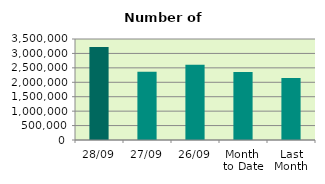
| Category | Series 0 |
|---|---|
| 28/09 | 3222836 |
| 27/09 | 2361406 |
| 26/09 | 2611168 |
| Month 
to Date | 2358583.7 |
| Last
Month | 2149140 |